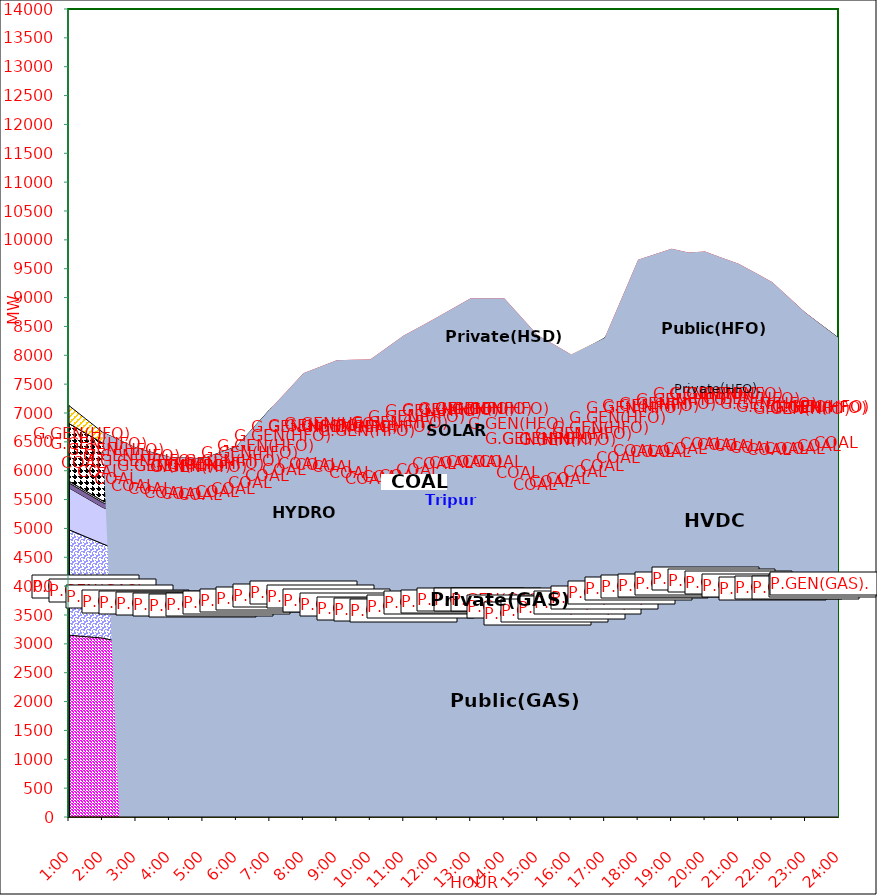
| Category | GAS | P.GEN(GAS). |  HVDC | TRIPURA | HYDRO | COAL | SOLAR | G.GEN(HFO) | P.GEN(HFO). | G.GEN(HSD) | P.GEN(HSD) | SHORTAGE | Total Energy Gen 194.016 MKWHr 
Energy Not Served   3.048 MKWHr 
Energy Requirement     197.064 MKWHr  |
|---|---|---|---|---|---|---|---|---|---|---|---|---|---|
| 1:00 | 3150 | 1827 | 725 | 86 | 30 | 1000 | 0 | 0 | 310 | 0 | 0 | 0 |  |
| 1:30 | 3125.5 | 1730.5 | 678 | 85 | 30 | 1000 | 0 | 0 | 249 | 0 | 0 | 0 |  |
| 2:00 | 3101 | 1634 | 631 | 84 | 30 | 1000 | 0 | 0 | 188 | 0 | 0 | 0 |  |
| 2:30 | 3038.5 | 1581 | 631 | 83 | 30 | 1005 | 0 | 0 | 162.5 | 0 | 0 | 0 |  |
| 3:00 | 2976 | 1528 | 631 | 82 | 30 | 1010 | 0 | 0 | 137 | 0 | 0 | 0 |  |
| 3:30 | 2986.5 | 1469 | 631 | 80 | 30 | 980 | 0 | 0 | 136.5 | 0 | 0 | 0 |  |
| 4:00 | 2997 | 1410 | 631 | 78 | 30 | 950 | 0 | 0 | 136 | 0 | 0 | 0 |  |
| 4:30 | 2970.5 | 1421.5 | 631.5 | 79 | 30 | 950.5 | 0 | 0 | 136.5 | 0 | 0 | 0 |  |
| 5:00 | 2944 | 1433 | 632 | 80 | 30 | 951 | 0 | 0 | 137 | 0 | 0 | 0 |  |
| 5:30 | 2957 | 1460 | 631.5 | 83 | 30 | 961 | 0 | 0 | 189.5 | 0 | 0 | 0 |  |
| 6:00 | 2970 | 1487 | 631 | 86 | 30 | 971 | 0 | 0 | 242 | 0 | 0 | 0 |  |
| 6:30 | 2940 | 1611.5 | 631 | 85 | 30 | 1006 | 1.5 | 8 | 425.5 | 0 | 0 | 0 |  |
| 7:00 | 2910 | 1736 | 631 | 84 | 30 | 1041 | 3 | 16 | 609 | 0 | 0 | 0 |  |
| 7:30 | 2937.5 | 1785 | 642.5 | 87 | 30 | 1081 | 31 | 23 | 687 | 0 | 0 | 70.04 |  |
| 8:00 | 2965 | 1834 | 654 | 90 | 30 | 1121 | 59 | 30 | 765 | 0 | 0 | 140.079 |  |
| 8:30 | 2908 | 1809.5 | 701 | 92 | 30 | 1121 | 106 | 49 | 845.5 | 0 | 0 | 138.697 |  |
| 9:00 | 2851 | 1785 | 748 | 94 | 30 | 1121 | 153 | 68 | 926 | 0 | 0 | 137.315 |  |
| 9:30 | 2827.5 | 1699.5 | 764 | 95 | 30 | 1105.5 | 203 | 69.5 | 928 | 2.5 | 0 | 196.295 |  |
| 10:00 | 2804 | 1614 | 780 | 96 | 30 | 1090 | 253 | 71 | 930 | 5 | 0 | 255.276 |  |
| 10:30 | 2791 | 1604 | 833 | 97 | 30 | 1080 | 283.5 | 96.5 | 971 | 84 | 0 | 264.953 |  |
| 11:00 | 2778 | 1594 | 886 | 98 | 30 | 1070 | 314 | 122 | 1012 | 163 | 0 | 274.629 |  |
| 11:30 | 2827 | 1637 | 899 | 101 | 30 | 1057 | 324 | 127.5 | 1032 | 191.5 | 0 | 274.629 |  |
| 12:00 | 2876 | 1680 | 912 | 104 | 30 | 1044 | 334 | 133 | 1052 | 220 | 0 | 274.629 |  |
| 12:30 | 2899.5 | 1678 | 911.5 | 105 | 30 | 1039.5 | 326.5 | 146 | 1073 | 243.5 | 0 | 371.856 |  |
| 13:00 | 2923 | 1676 | 911 | 106 | 30 | 1035 | 319 | 159 | 1094 | 267 | 0 | 469.082 |  |
| 13:30 | 2923 | 1676 | 911 | 106 | 30 | 1035 | 319 | 159 | 1094 | 267 | 0 | 469.082 |  |
| 14:00 | 2923 | 1676 | 911 | 106 | 30 | 1035 | 319 | 159 | 1094 | 267 | 0 | 469.082 |  |
| 14:30 | 2881.5 | 1532.5 | 910 | 107 | 30 | 1009.5 | 250.5 | 199.5 | 1155.5 | 266.5 | 0 | 326.698 |  |
| 15:00 | 2840 | 1389 | 909 | 108 | 30 | 984 | 182 | 240 | 1217 | 266 | 0 | 184.315 |  |
| 15:30 | 2872 | 1420.5 | 909 | 106 | 30 | 958 | 135 | 248 | 1265 | 145.5 | 0 | 92.157 |  |
| 16:00 | 2904 | 1452 | 909 | 104 | 30 | 932 | 88 | 256 | 1313 | 25 | 0 | 0 |  |
| 16:30 | 2970.5 | 1500.5 | 909 | 104 | 30 | 933.5 | 54 | 288 | 1353.5 | 12.5 | 0 | 0 |  |
| 17:00 | 3037 | 1549 | 909 | 104 | 30 | 935 | 20 | 320 | 1394 | 0 | 0 | 0 |  |
| 17:30 | 3081.5 | 1613 | 911 | 112 | 30 | 950 | 10 | 429.5 | 1604 | 0 | 0 | 235.462 |  |
| 18:00 | 3126 | 1677 | 913 | 120 | 30 | 965 | 0 | 539 | 1814 | 0 | 0 | 470.925 |  |
| 18:30 | 3153 | 1673.5 | 852 | 117 | 30 | 1030.5 | 0 | 547.5 | 1910.5 | 0 | 0 | 435.462 |  |
| 19:00 | 3180 | 1670 | 791 | 114 | 30 | 1096 | 0 | 556 | 2007 | 0 | 0 | 400 |  |
| 19:30 | 3214 | 1653 | 791 | 112 | 30 | 1155 | 0 | 554 | 2059 | 0 | 0 | 215 |  |
| 20:00 | 3311 | 1646 | 795 | 114 | 30 | 1165 | 0 | 555 | 2152 | 0 | 0 | 30 |  |
| 20:30 | 3276.5 | 1644.5 | 803 | 112 | 30 | 1190.5 | 0 | 557.5 | 2045.5 | 0 | 0 | 32.5 |  |
| 21:00 | 3242 | 1643 | 811 | 110 | 30 | 1216 | 0 | 560 | 1939 | 0 | 0 | 35 |  |
| 21:30 | 3212 | 1604.5 | 859 | 107 | 30 | 1191 | 0 | 492 | 1903 | 0 | 0 | 30 |  |
| 22:00 | 3182 | 1566 | 907 | 104 | 30 | 1166 | 0 | 424 | 1867 | 0 | 0 | 25 |  |
| 22:30 | 3184.5 | 1570.5 | 906.5 | 104 | 30 | 1165.5 | 0 | 316.5 | 1710 | 0 | 0 | 17.5 |  |
| 23:00 | 3187 | 1575 | 906 | 104 | 30 | 1165 | 0 | 209 | 1553 | 0 | 0 | 10 |  |
| 23:30 | 3199 | 1619.5 | 906 | 101 | 30 | 1165 | 0 | 138.5 | 1353 | 0 | 0 | 5 |  |
| 24:00 | 3211 | 1664 | 906 | 98 | 30 | 1165 | 0 | 68 | 1153 | 0 | 0 | 0 |  |